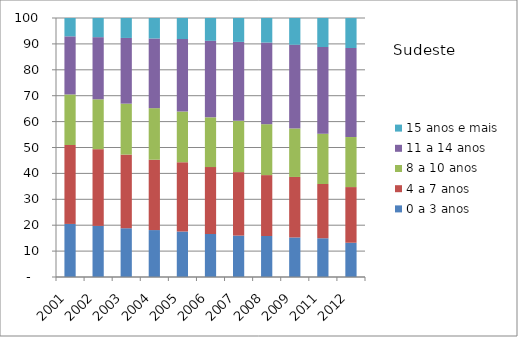
| Category | 0 a 3 anos | 4 a 7 anos | 8 a 10 anos | 11 a 14 anos | 15 anos e mais |
|---|---|---|---|---|---|
| 2001.0 | 20.49 | 30.47 | 19.53 | 22.43 | 7.08 |
| 2002.0 | 19.74 | 29.61 | 19.26 | 23.99 | 7.39 |
| 2003.0 | 18.83 | 28.43 | 19.67 | 25.37 | 7.7 |
| 2004.0 | 18.12 | 27.16 | 19.91 | 26.9 | 7.92 |
| 2005.0 | 17.56 | 26.75 | 19.57 | 27.99 | 8.13 |
| 2006.0 | 16.64 | 25.8 | 19.21 | 29.54 | 8.82 |
| 2007.0 | 15.99 | 24.51 | 19.83 | 30.44 | 9.23 |
| 2008.0 | 15.82 | 23.52 | 19.66 | 31.52 | 9.48 |
| 2009.0 | 15.27 | 23.36 | 18.73 | 32.31 | 10.33 |
| 2011.0 | 14.96 | 20.94 | 19.43 | 33.47 | 11.2 |
| 2012.0 | 13.23 | 21.49 | 19.32 | 34.38 | 11.56 |